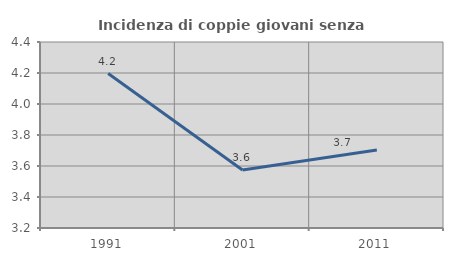
| Category | Incidenza di coppie giovani senza figli |
|---|---|
| 1991.0 | 4.196 |
| 2001.0 | 3.574 |
| 2011.0 | 3.704 |